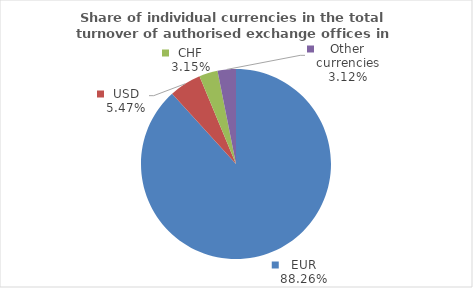
| Category | Series 0 |
|---|---|
| EUR | 88.261 |
| USD | 5.464 |
| CHF | 3.152 |
| Other currencies | 3.124 |